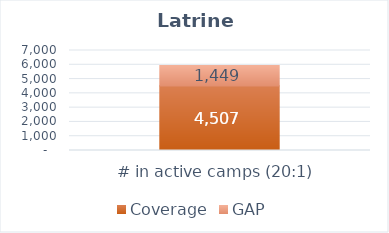
| Category |  Coverage  |  GAP  |
|---|---|---|
|  # in active camps (20:1)  | 4507 | 1449 |